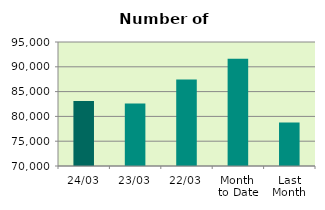
| Category | Series 0 |
|---|---|
| 24/03 | 83118 |
| 23/03 | 82584 |
| 22/03 | 87456 |
| Month 
to Date | 91634.111 |
| Last
Month | 78748.7 |